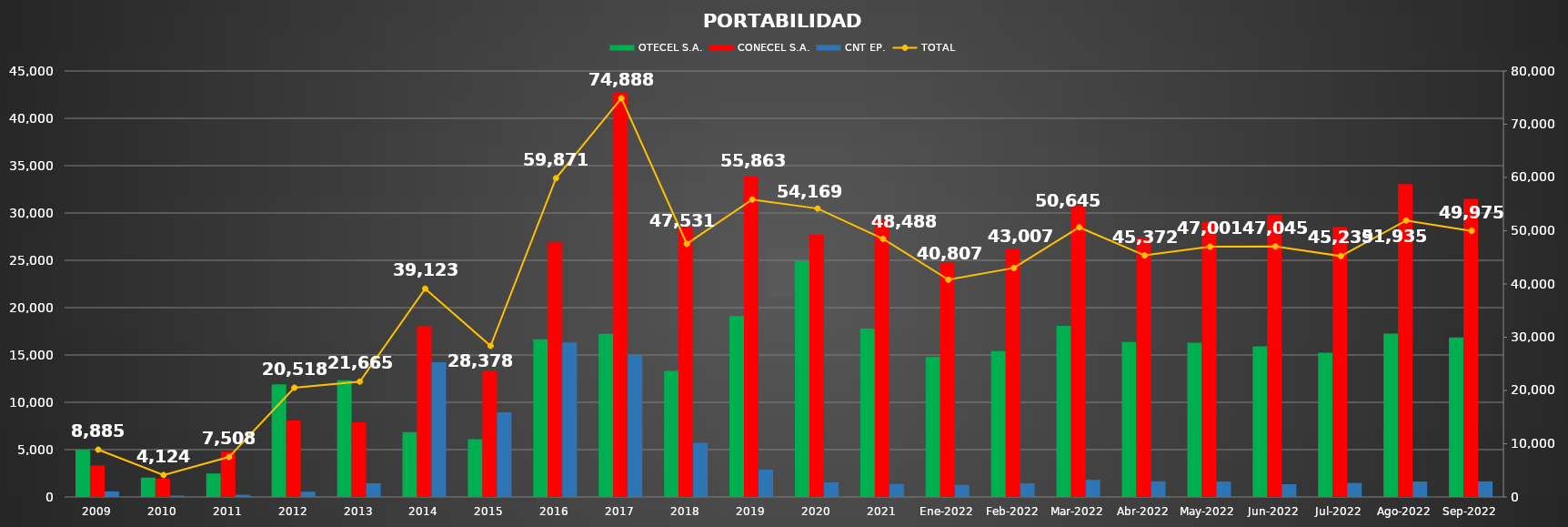
| Category | OTECEL S.A. | CONECEL S.A. | CNT EP. |
|---|---|---|---|
| 2009 | 4973 | 3324 | 588 |
| 2010 | 2045 | 1939 | 140 |
| 2011 | 2484 | 4796 | 228 |
| 2012 | 11894 | 8067 | 557 |
| 2013 | 12323 | 7893 | 1449 |
| 2014 | 6853 | 18039 | 14231 |
| 2015 | 6105 | 13334 | 8939 |
| 2016 | 16653 | 26907 | 16311 |
| 2017 | 17228 | 42694 | 14966 |
| 2018 | 13309 | 28504 | 5718 |
| 2019 | 19116 | 33857 | 2890 |
| 2020 | 24933 | 27700 | 1536 |
| 2021 | 17795 | 29321 | 1372 |
| Ene-2022 | 14781 | 24752 | 1274 |
| Feb-2022 | 15406 | 26168 | 1433 |
| Mar-2022 | 18084 | 30756 | 1805 |
| Abr-2022 | 16370 | 27352 | 1650 |
| May-2022 | 16305 | 29073 | 1623 |
| Jun-2022 | 15912 | 29786 | 1347 |
| Jul-2022 | 15250 | 28511 | 1478 |
| Ago-2022 | 17256 | 33054 | 1625 |
| Sep-2022 | 16844 | 31482 | 1649 |